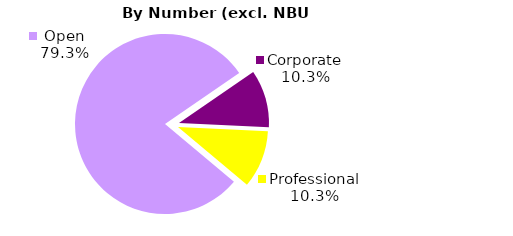
| Category | Series 0 |
|---|---|
| Open | 46 |
| Corporate | 6 |
| Professional | 6 |